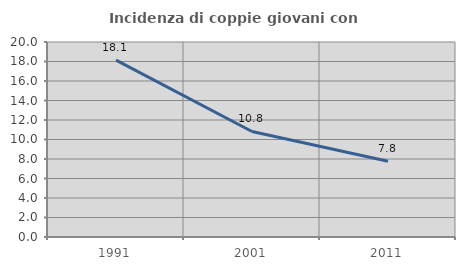
| Category | Incidenza di coppie giovani con figli |
|---|---|
| 1991.0 | 18.142 |
| 2001.0 | 10.821 |
| 2011.0 | 7.761 |